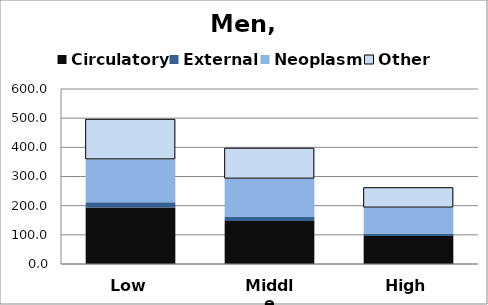
| Category | Circulatory | External | Neoplasm | Other |
|---|---|---|---|---|
| Low | 193.332 | 18.324 | 147.123 | 137.303 |
| Middle | 147.734 | 13.624 | 131.358 | 104.29 |
| High | 96.084 | 8.908 | 88.48 | 68.116 |